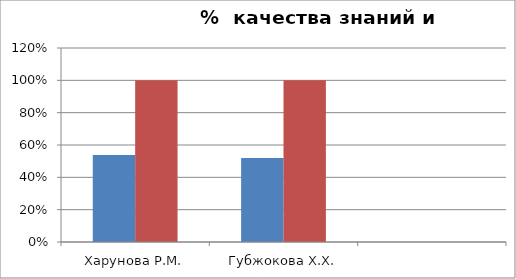
| Category | Series 0 | 2 |
|---|---|---|
| Харунова Р.М. | 0.538 | 1 |
| Губжокова Х.Х. | 0.52 | 1 |